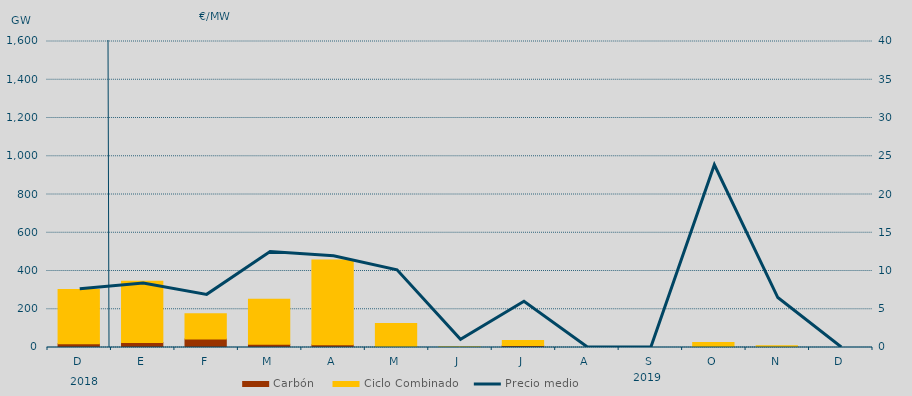
| Category | Carbón | Ciclo Combinado |
|---|---|---|
| D | 19590.2 | 283346.4 |
| E | 26403.5 | 320317.9 |
| F | 44880.1 | 131505 |
| M | 17298.8 | 234585 |
| A | 14816 | 442359.9 |
| M | 5017.5 | 120808.3 |
| J | 0 | 4200 |
| J | 10582.1 | 26246.2 |
| A | 0 | 0 |
| S | 0 | 0 |
| O | 0 | 25712.6 |
| N | 0 | 8552.1 |
| D | 0 | 0 |